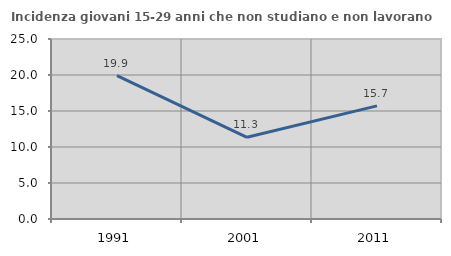
| Category | Incidenza giovani 15-29 anni che non studiano e non lavorano  |
|---|---|
| 1991.0 | 19.9 |
| 2001.0 | 11.346 |
| 2011.0 | 15.711 |